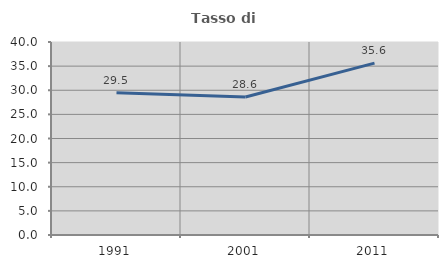
| Category | Tasso di occupazione   |
|---|---|
| 1991.0 | 29.493 |
| 2001.0 | 28.609 |
| 2011.0 | 35.629 |